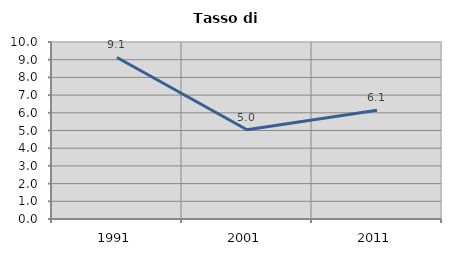
| Category | Tasso di disoccupazione   |
|---|---|
| 1991.0 | 9.127 |
| 2001.0 | 5.039 |
| 2011.0 | 6.149 |